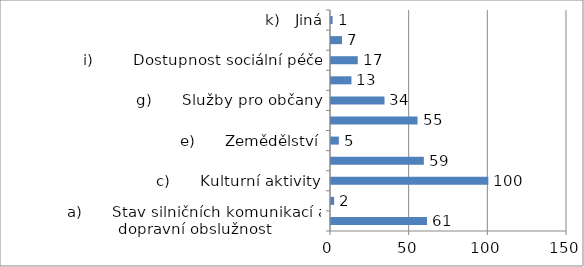
| Category | Series 0 |
|---|---|
| a)      Stav silničních komunikací a dopravní obslužnost | 61 |
| b)      Cestovní ruch a ubytovací kapacity | 2 |
| c)      Kulturní aktivity | 100 |
| d)     Sportovní aktivity | 59 |
| e)      Zemědělství | 5 |
| f)       Životní prostředí | 55 |
| g)      Služby pro občany | 34 |
| h)      Obchod a obchodní služby | 13 |
| i)        Dostupnost sociální péče | 17 |
| j)        Dostupnost zdravotní péče | 7 |
|                   k)   Jiná | 1 |